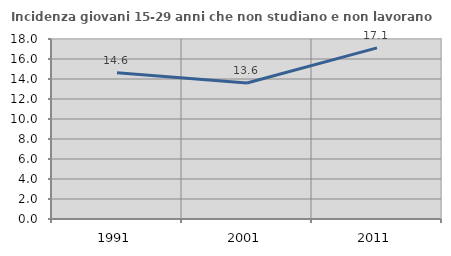
| Category | Incidenza giovani 15-29 anni che non studiano e non lavorano  |
|---|---|
| 1991.0 | 14.634 |
| 2001.0 | 13.603 |
| 2011.0 | 17.108 |